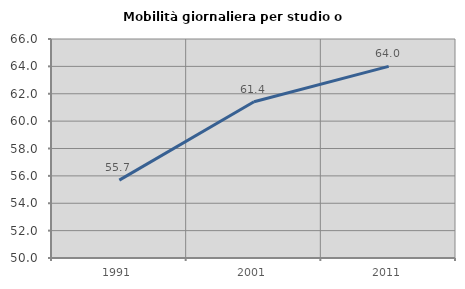
| Category | Mobilità giornaliera per studio o lavoro |
|---|---|
| 1991.0 | 55.687 |
| 2001.0 | 61.412 |
| 2011.0 | 64 |